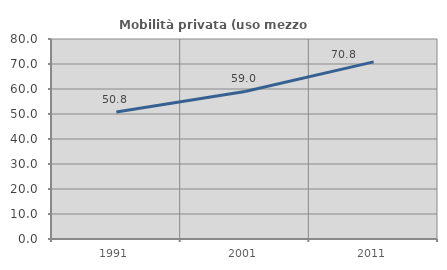
| Category | Mobilità privata (uso mezzo privato) |
|---|---|
| 1991.0 | 50.829 |
| 2001.0 | 59.013 |
| 2011.0 | 70.843 |